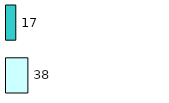
| Category | Series 0 | Series 1 |
|---|---|---|
| 0 | 38 | 17 |